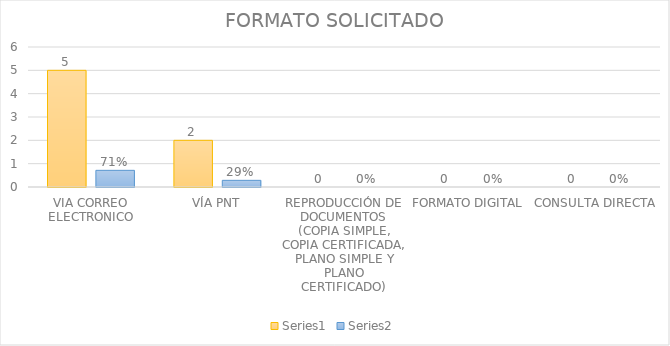
| Category | Series 3 | Series 4 |
|---|---|---|
| VIA CORREO ELECTRONICO | 5 | 0.714 |
| VÍA PNT | 2 | 0.286 |
| REPRODUCCIÓN DE DOCUMENTOS (COPIA SIMPLE, COPIA CERTIFICADA, PLANO SIMPLE Y PLANO CERTIFICADO) | 0 | 0 |
| FORMATO DIGITAL | 0 | 0 |
| CONSULTA DIRECTA | 0 | 0 |